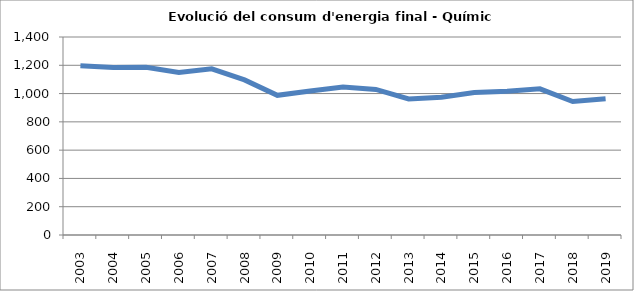
| Category | 1.196,9 |
|---|---|
| 2003.0 | 1196.89 |
| 2004.0 | 1183.9 |
| 2005.0 | 1186.34 |
| 2006.0 | 1149.73 |
| 2007.0 | 1175.02 |
| 2008.0 | 1096.76 |
| 2009.0 | 987.49 |
| 2010.0 | 1018.75 |
| 2011.0 | 1045.72 |
| 2012.0 | 1029.44 |
| 2013.0 | 962.28 |
| 2014.0 | 973.75 |
| 2015.0 | 1006.91 |
| 2016.0 | 1015.78 |
| 2017.0 | 1033.48 |
| 2018.0 | 943.67 |
| 2019.0 | 963.5 |